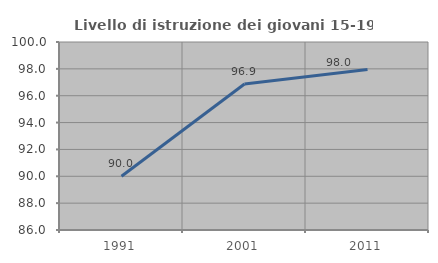
| Category | Livello di istruzione dei giovani 15-19 anni |
|---|---|
| 1991.0 | 90 |
| 2001.0 | 96.875 |
| 2011.0 | 97.959 |